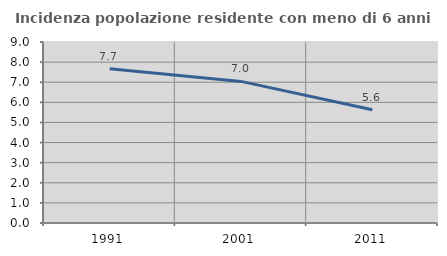
| Category | Incidenza popolazione residente con meno di 6 anni |
|---|---|
| 1991.0 | 7.672 |
| 2001.0 | 7.041 |
| 2011.0 | 5.628 |